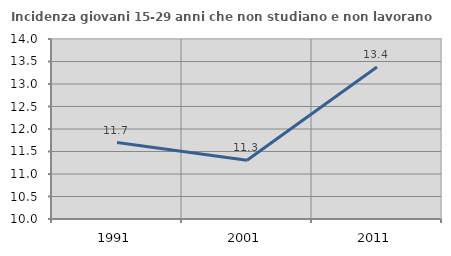
| Category | Incidenza giovani 15-29 anni che non studiano e non lavorano  |
|---|---|
| 1991.0 | 11.699 |
| 2001.0 | 11.304 |
| 2011.0 | 13.38 |